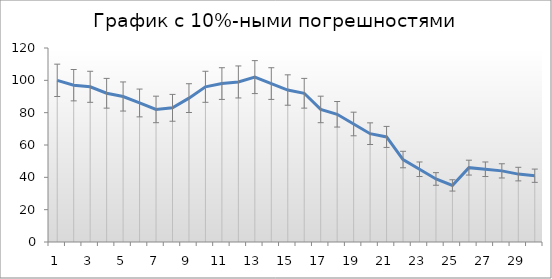
| Category | Series 0 |
|---|---|
| 0 | 100 |
| 1 | 97 |
| 2 | 96 |
| 3 | 92 |
| 4 | 90 |
| 5 | 86 |
| 6 | 82 |
| 7 | 83 |
| 8 | 89 |
| 9 | 96 |
| 10 | 98 |
| 11 | 99 |
| 12 | 102 |
| 13 | 98 |
| 14 | 94 |
| 15 | 92 |
| 16 | 82 |
| 17 | 79 |
| 18 | 73 |
| 19 | 67 |
| 20 | 65 |
| 21 | 51 |
| 22 | 45 |
| 23 | 39 |
| 24 | 35 |
| 25 | 46 |
| 26 | 45 |
| 27 | 44 |
| 28 | 42 |
| 29 | 41 |